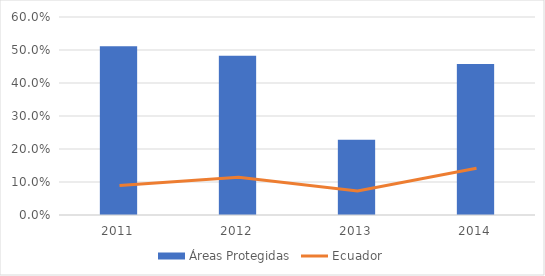
| Category | Áreas Protegidas |
|---|---|
| 0 | 0.511 |
| 1 | 0.482 |
| 2 | 0.228 |
| 3 | 0.457 |